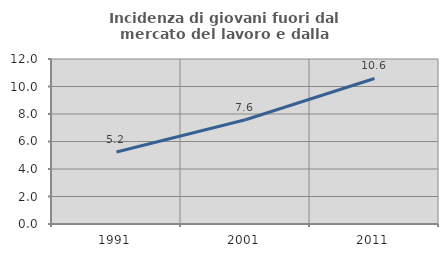
| Category | Incidenza di giovani fuori dal mercato del lavoro e dalla formazione  |
|---|---|
| 1991.0 | 5.241 |
| 2001.0 | 7.582 |
| 2011.0 | 10.585 |